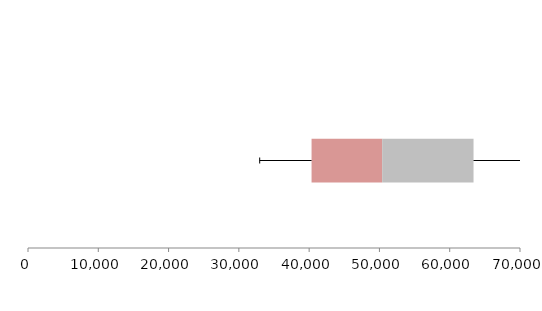
| Category | Series 1 | Series 2 | Series 3 |
|---|---|---|---|
| 0 | 40345.17 | 10045.41 | 12997.751 |